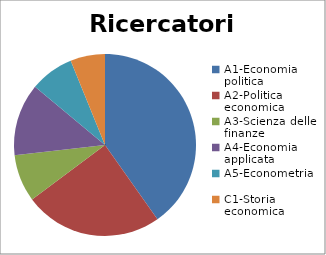
| Category | Ricercatori t.d. | Series 1 |
|---|---|---|
| A1-Economia politica | 72 |  |
| A2-Politica economica | 44 |  |
| A3-Scienza delle finanze | 15 |  |
| A4-Economia applicata | 23 |  |
| A5-Econometria | 14 |  |
| C1-Storia economica | 11 |  |